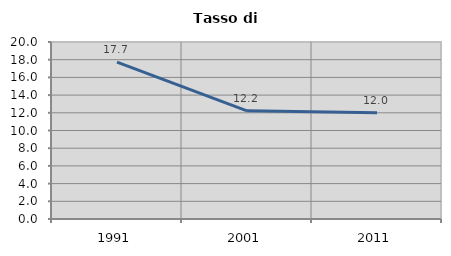
| Category | Tasso di disoccupazione   |
|---|---|
| 1991.0 | 17.727 |
| 2001.0 | 12.218 |
| 2011.0 | 12.005 |